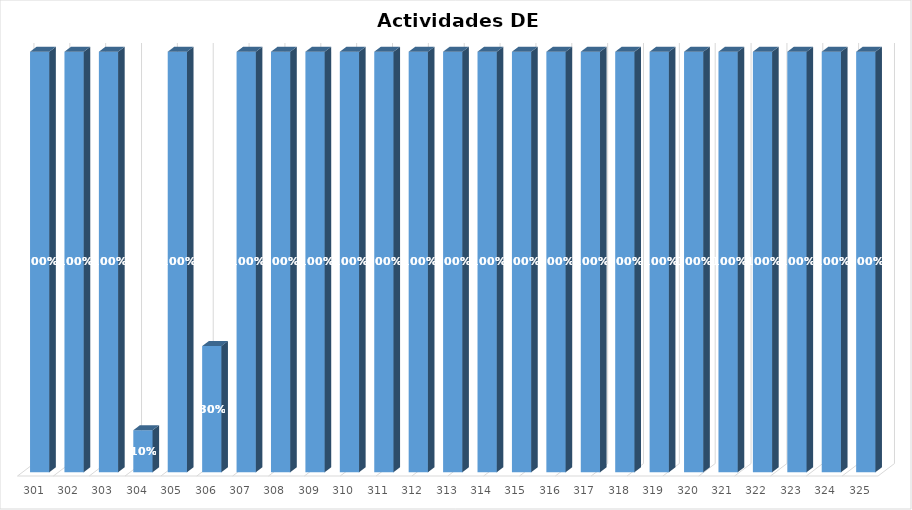
| Category | % Avance |
|---|---|
| 301.0 | 1 |
| 302.0 | 1 |
| 303.0 | 1 |
| 304.0 | 0.1 |
| 305.0 | 1 |
| 306.0 | 0.3 |
| 307.0 | 1 |
| 308.0 | 1 |
| 309.0 | 1 |
| 310.0 | 1 |
| 311.0 | 1 |
| 312.0 | 1 |
| 313.0 | 1 |
| 314.0 | 1 |
| 315.0 | 1 |
| 316.0 | 1 |
| 317.0 | 1 |
| 318.0 | 1 |
| 319.0 | 1 |
| 320.0 | 1 |
| 321.0 | 1 |
| 322.0 | 1 |
| 323.0 | 1 |
| 324.0 | 1 |
| 325.0 | 1 |